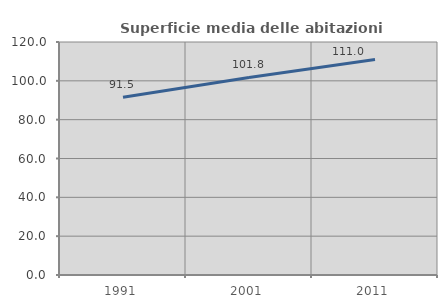
| Category | Superficie media delle abitazioni occupate |
|---|---|
| 1991.0 | 91.52 |
| 2001.0 | 101.754 |
| 2011.0 | 111.039 |